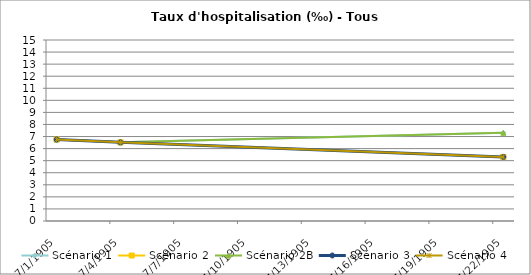
| Category | Scénario 1 | Scénario 2 | Scénario 2B | Scénario 3 | Scénario 4 |
|---|---|---|---|---|---|
| 2009.0 | 6.756 | 6.756 | 6.756 | 6.756 | 6.756 |
| 2012.0 | 6.518 | 6.518 | 6.518 | 6.518 | 6.518 |
| 2030.0 | 7.307 | 5.31 | 7.307 | 5.31 | 5.31 |